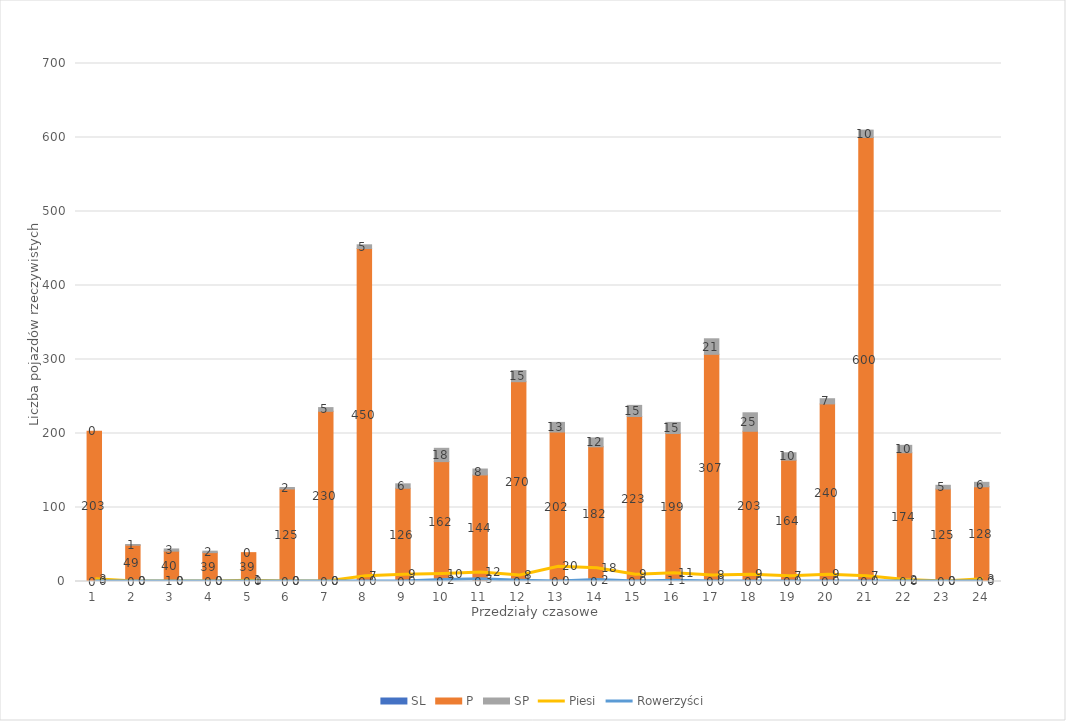
| Category | SL | P | SP |
|---|---|---|---|
| 0 | 0 | 203 | 0 |
| 1 | 0 | 49 | 1 |
| 2 | 1 | 40 | 3 |
| 3 | 0 | 39 | 2 |
| 4 | 0 | 39 | 0 |
| 5 | 0 | 125 | 2 |
| 6 | 0 | 230 | 5 |
| 7 | 0 | 450 | 5 |
| 8 | 0 | 126 | 6 |
| 9 | 0 | 162 | 18 |
| 10 | 0 | 144 | 8 |
| 11 | 0 | 270 | 15 |
| 12 | 0 | 202 | 13 |
| 13 | 0 | 182 | 12 |
| 14 | 0 | 223 | 15 |
| 15 | 1 | 199 | 15 |
| 16 | 0 | 307 | 21 |
| 17 | 0 | 203 | 25 |
| 18 | 0 | 164 | 10 |
| 19 | 0 | 240 | 7 |
| 20 | 0 | 600 | 10 |
| 21 | 0 | 174 | 10 |
| 22 | 0 | 125 | 5 |
| 23 | 0 | 128 | 6 |